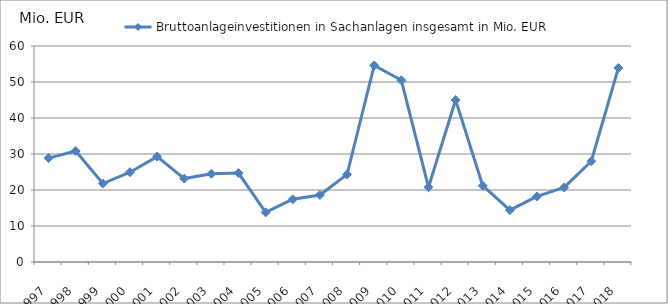
| Category | Bruttoanlageinvestitionen in Sachanlagen insgesamt in Mio. EUR |
|---|---|
| 1997.0 | 28.865 |
| 1998.0 | 30.842 |
| 1999.0 | 21.802 |
| 2000.0 | 24.946 |
| 2001.0 | 29.275 |
| 2002.0 | 23.169 |
| 2003.0 | 24.503 |
| 2004.0 | 24.7 |
| 2005.0 | 13.785 |
| 2006.0 | 17.429 |
| 2007.0 | 18.62 |
| 2008.0 | 24.327 |
| 2009.0 | 54.596 |
| 2010.0 | 50.471 |
| 2011.0 | 20.783 |
| 2012.0 | 45 |
| 2013.0 | 21.19 |
| 2014.0 | 14.408 |
| 2015.0 | 18.216 |
| 2016.0 | 20.707 |
| 2017.0 | 27.98 |
| 2018.0 | 53.918 |